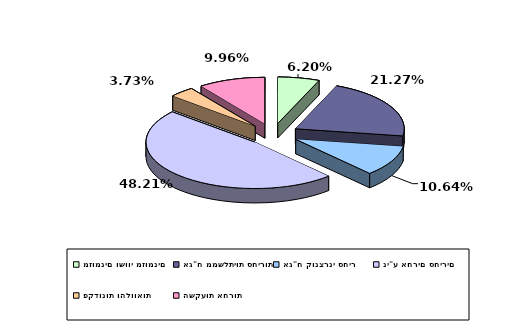
| Category | Series 0 |
|---|---|
| מזומנים ושווי מזומנים | 0.062 |
| אג"ח ממשלתיות סחירות | 0.213 |
| אג"ח קונצרני סחיר | 0.106 |
| ני"ע אחרים סחירים | 0.482 |
| פקדונות והלוואות | 0.037 |
| השקעות אחרות | 0.1 |